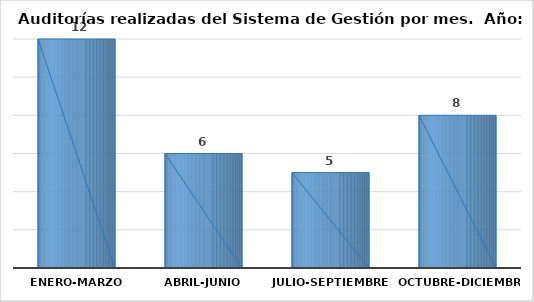
| Category | Series 0 |
|---|---|
| Enero-Marzo | 12 |
| Abril-Junio | 6 |
| Julio-Septiembre | 5 |
| Octubre-Diciembre | 8 |